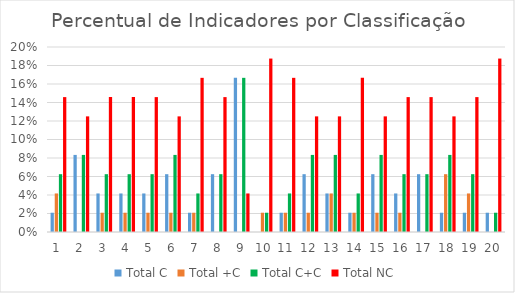
| Category | Total C | Total +C | Total C+C | Total NC |
|---|---|---|---|---|
| 0 | 0.021 | 0.042 | 0.062 | 0.146 |
| 1 | 0.083 | 0 | 0.083 | 0.125 |
| 2 | 0.042 | 0.021 | 0.062 | 0.146 |
| 3 | 0.042 | 0.021 | 0.062 | 0.146 |
| 4 | 0.042 | 0.021 | 0.062 | 0.146 |
| 5 | 0.062 | 0.021 | 0.083 | 0.125 |
| 6 | 0.021 | 0.021 | 0.042 | 0.167 |
| 7 | 0.062 | 0 | 0.062 | 0.146 |
| 8 | 0.167 | 0 | 0.167 | 0.042 |
| 9 | 0 | 0.021 | 0.021 | 0.188 |
| 10 | 0.021 | 0.021 | 0.042 | 0.167 |
| 11 | 0.062 | 0.021 | 0.083 | 0.125 |
| 12 | 0.042 | 0.042 | 0.083 | 0.125 |
| 13 | 0.021 | 0.021 | 0.042 | 0.167 |
| 14 | 0.062 | 0.021 | 0.083 | 0.125 |
| 15 | 0.042 | 0.021 | 0.062 | 0.146 |
| 16 | 0.062 | 0 | 0.062 | 0.146 |
| 17 | 0.021 | 0.062 | 0.083 | 0.125 |
| 18 | 0.021 | 0.042 | 0.062 | 0.146 |
| 19 | 0.021 | 0 | 0.021 | 0.188 |